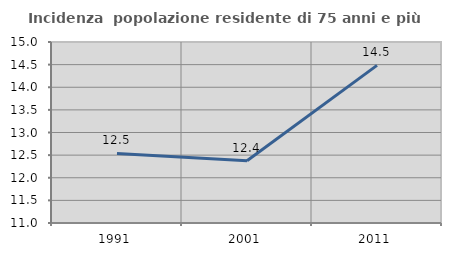
| Category | Incidenza  popolazione residente di 75 anni e più |
|---|---|
| 1991.0 | 12.538 |
| 2001.0 | 12.377 |
| 2011.0 | 14.483 |